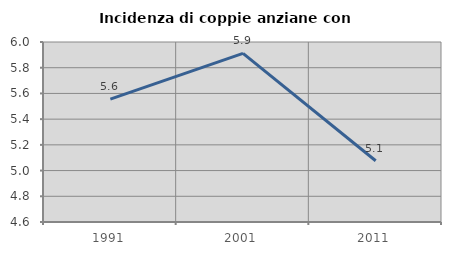
| Category | Incidenza di coppie anziane con figli |
|---|---|
| 1991.0 | 5.556 |
| 2001.0 | 5.911 |
| 2011.0 | 5.076 |